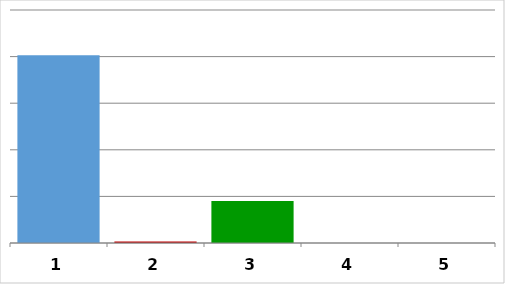
| Category | Series 0 |
|---|---|
| 0 | 20155836.35 |
| 1 | 150000 |
| 2 | 4493044 |
| 3 | 0 |
| 4 | 0 |